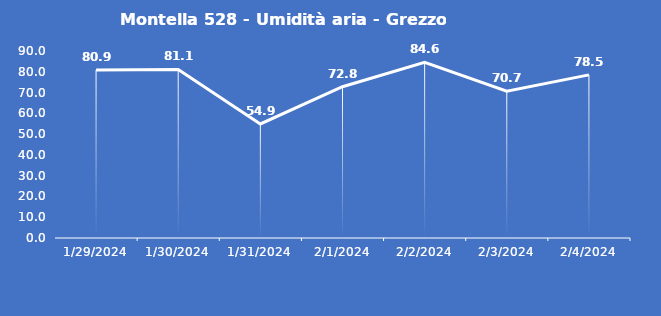
| Category | Montella 528 - Umidità aria - Grezzo (%) |
|---|---|
| 1/29/24 | 80.9 |
| 1/30/24 | 81.1 |
| 1/31/24 | 54.9 |
| 2/1/24 | 72.8 |
| 2/2/24 | 84.6 |
| 2/3/24 | 70.7 |
| 2/4/24 | 78.5 |